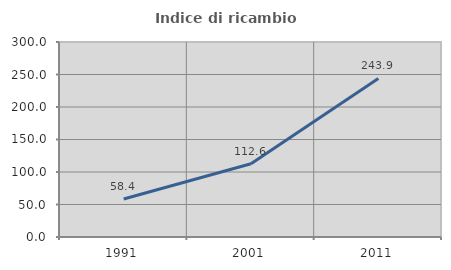
| Category | Indice di ricambio occupazionale  |
|---|---|
| 1991.0 | 58.392 |
| 2001.0 | 112.634 |
| 2011.0 | 243.879 |